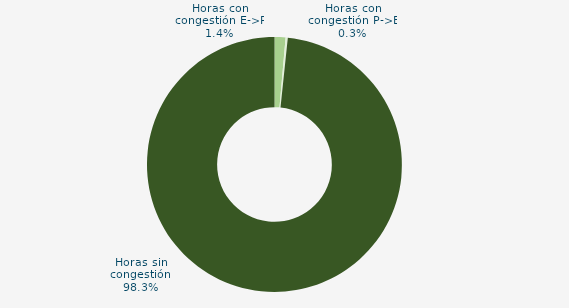
| Category | Horas con congestión E->P |
|---|---|
| Horas con congestión E->P | 1.389 |
| Horas con congestión P->E | 0.278 |
| Horas sin congestión | 98.333 |